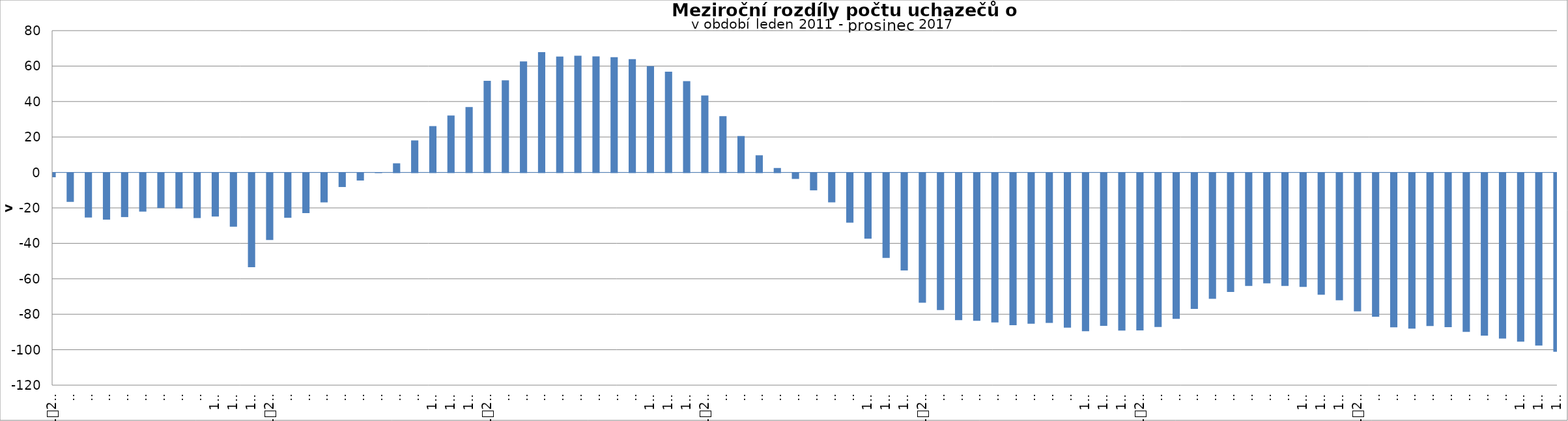
| Category | Series 1 |
|---|---|
| 0 | -2363 |
| 1 | -16239 |
| 2 | -25062 |
| 3 | -26286 |
| 4 | -24823 |
| 5 | -21725 |
| 6 | -19700 |
| 7 | -19959 |
| 8 | -25366 |
| 9 | -24543 |
| 10 | -30236 |
| 11 | -53100 |
| 12 | -37774 |
| 13 | -25211 |
| 14 | -22582 |
| 15 | -16520 |
| 16 | -7857 |
| 17 | -4189 |
| 18 | 13 |
| 19 | 5158 |
| 20 | 18070 |
| 21 | 26144 |
| 22 | 32094 |
| 23 | 36860 |
| 24 | 51720 |
| 25 | 51998 |
| 26 | 62588 |
| 27 | 67906 |
| 28 | 65364 |
| 29 | 65887 |
| 30 | 65499 |
| 31 | 65038 |
| 32 | 63873 |
| 33 | 59919 |
| 34 | 56815 |
| 35 | 51522 |
| 36 | 43465 |
| 37 | 31707 |
| 38 | 20547 |
| 39 | 9680 |
| 40 | 2510 |
| 41 | -3294 |
| 42 | -9732 |
| 43 | -16506 |
| 44 | -27960 |
| 45 | -37043 |
| 46 | -47805 |
| 47 | -54919 |
| 48 | -73083 |
| 49 | -77273 |
| 50 | -83000 |
| 51 | -83323 |
| 52 | -84284 |
| 53 | -85784 |
| 54 | -85023 |
| 55 | -84559 |
| 56 | -87206 |
| 57 | -89206 |
| 58 | -86144 |
| 59 | -88796 |
| 60 | -88788 |
| 61 | -86863 |
| 62 | -82206 |
| 63 | -76625 |
| 64 | -70900 |
| 65 | -67067 |
| 66 | -63674 |
| 67 | -62192 |
| 68 | -63634 |
| 69 | -64188 |
| 70 | -68609 |
| 71 | -71745 |
| 72 | -77987 |
| 73 | -81046 |
| 74 | -86997 |
| 75 | -87761 |
| 76 | -86268 |
| 77 | -86889 |
| 78 | -89593 |
| 79 | -91648 |
| 80 | -93343 |
| 81 | -95071 |
| 82 | -97286 |
| 83 | -100753 |